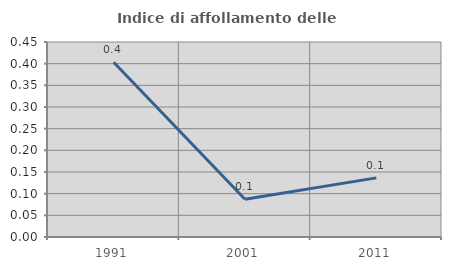
| Category | Indice di affollamento delle abitazioni  |
|---|---|
| 1991.0 | 0.403 |
| 2001.0 | 0.087 |
| 2011.0 | 0.136 |